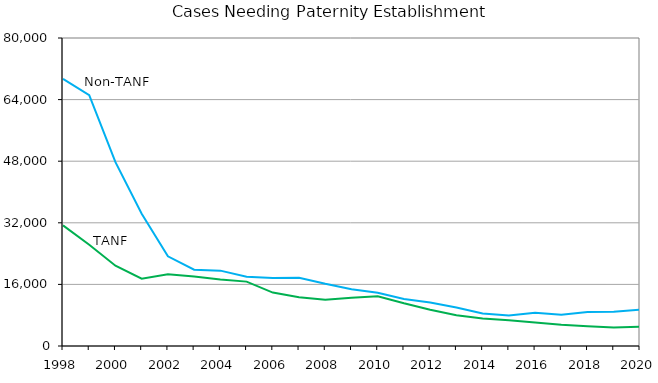
| Category |   TANF | Non-TANF |
|---|---|---|
| 1998 | 31321 | 69372 |
| 1999 | 26285 | 65169 |
| 2000 | 20851 | 47763 |
| 2001 | 17477 | 34352 |
| 2002 | 18641 | 23290 |
| 2003 | 18055 | 19814 |
| 2004 | 17293 | 19575 |
| 2005 | 16723 | 17975 |
| 2006 | 13877 | 17673 |
| 2007 | 12659 | 17750 |
| 2008 | 12005 | 16167 |
| 2009 | 12557 | 14765 |
| 2010 | 12931 | 13855 |
| 2011 | 11082 | 12195 |
| 2012 | 9432 | 11276 |
| 2013 | 7988 | 10023 |
| 2014 | 7147 | 8420 |
| 2015 | 6678 | 7913 |
| 2016 | 6079 | 8634 |
| 2017 | 5523 | 8127 |
| 2018 | 5154 | 8862 |
| 2019 | 4830 | 8896 |
| 2020 | 5004 | 9467 |